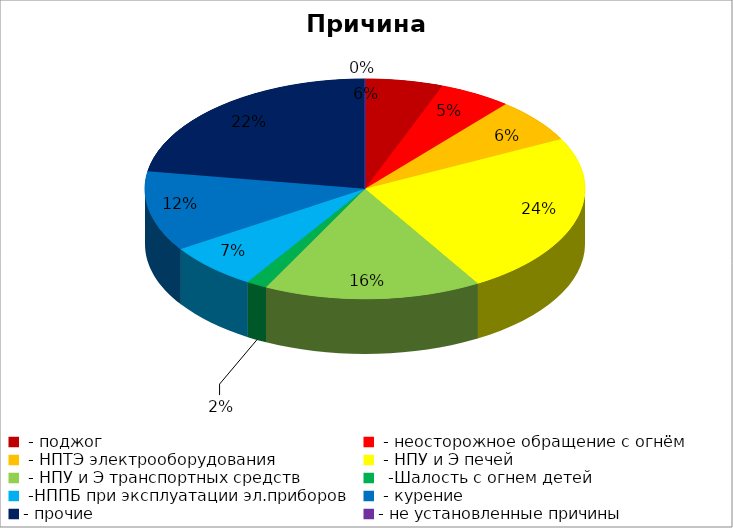
| Category | Причина пожара |
|---|---|
|  - поджог | 15 |
|  - неосторожное обращение с огнём | 14 |
|  - НПТЭ электрооборудования | 17 |
|  - НПУ и Э печей | 63 |
|  - НПУ и Э транспортных средств | 42 |
|   -Шалость с огнем детей | 4 |
|  -НППБ при эксплуатации эл.приборов | 18 |
|  - курение | 31 |
| - прочие | 59 |
| - не установленные причины | 0 |